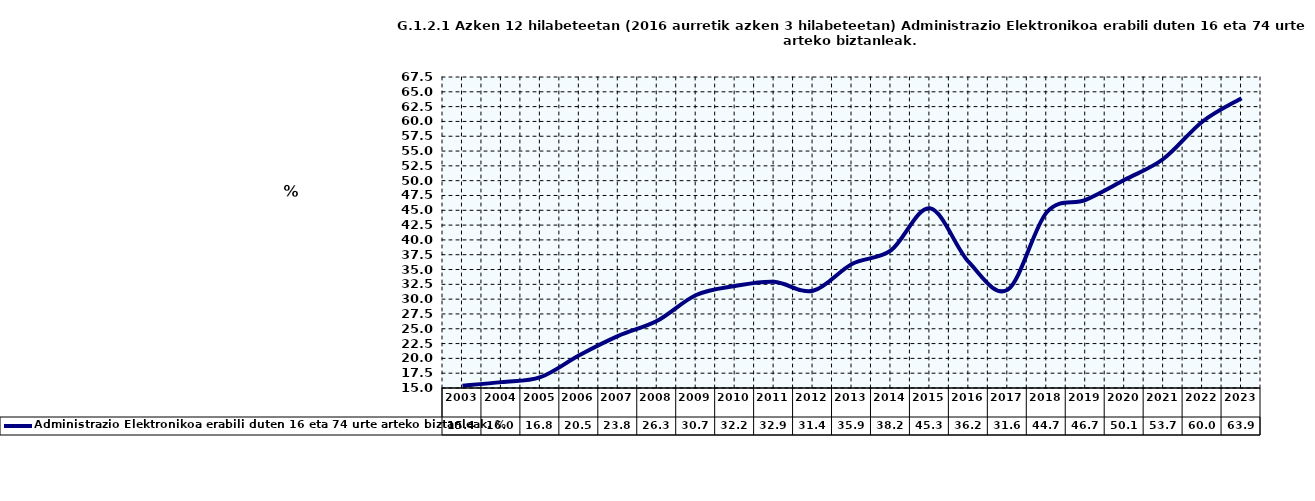
| Category | Administrazio Elektronikoa erabili duten 16 eta 74 urte arteko biztanleak. % |
|---|---|
| 2003.0 | 15.375 |
| 2004.0 | 15.991 |
| 2005.0 | 16.831 |
| 2006.0 | 20.537 |
| 2007.0 | 23.794 |
| 2008.0 | 26.338 |
| 2009.0 | 30.694 |
| 2010.0 | 32.207 |
| 2011.0 | 32.922 |
| 2012.0 | 31.411 |
| 2013.0 | 35.945 |
| 2014.0 | 38.224 |
| 2015.0 | 45.329 |
| 2016.0 | 36.231 |
| 2017.0 | 31.608 |
| 2018.0 | 44.663 |
| 2019.0 | 46.748 |
| 2020.0 | 50.139 |
| 2021.0 | 53.699 |
| 2022.0 | 59.995 |
| 2023.0 | 63.927 |